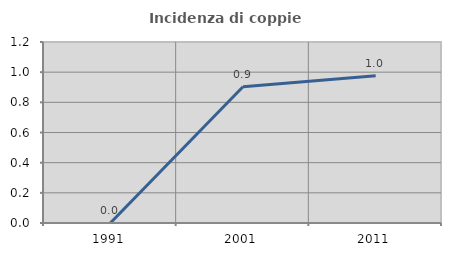
| Category | Incidenza di coppie miste |
|---|---|
| 1991.0 | 0 |
| 2001.0 | 0.903 |
| 2011.0 | 0.977 |